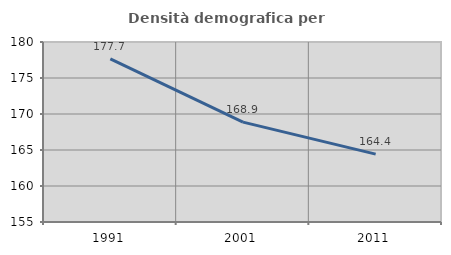
| Category | Densità demografica |
|---|---|
| 1991.0 | 177.657 |
| 2001.0 | 168.866 |
| 2011.0 | 164.427 |